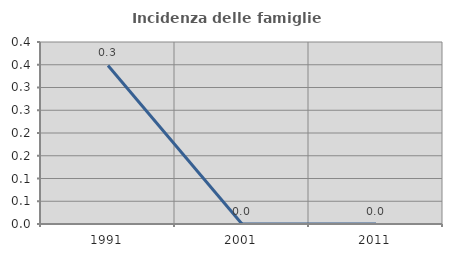
| Category | Incidenza delle famiglie numerose |
|---|---|
| 1991.0 | 0.348 |
| 2001.0 | 0 |
| 2011.0 | 0 |